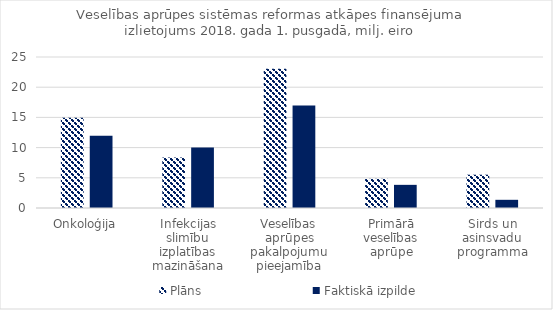
| Category | Plāns | Faktiskā izpilde |
|---|---|---|
| Onkoloģija | 14.948 | 11.953 |
| Infekcijas slimību izplatības mazināšana | 8.37 | 10.022 |
| Veselības aprūpes pakalpojumu pieejamība | 23.037 | 16.956 |
| Primārā veselības aprūpe | 4.832 | 3.833 |
| Sirds un asinsvadu programma | 5.513 | 1.356 |